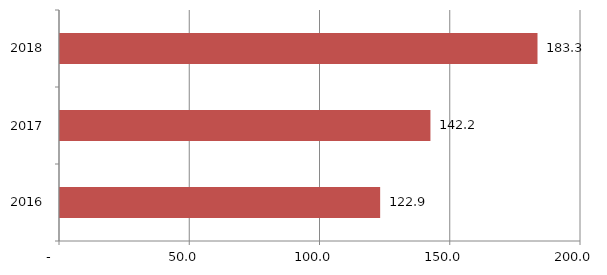
| Category | Series 0 |
|---|---|
| 2016.0 | 122.9 |
| 2017.0 | 142.2 |
| 2018.0 | 183.3 |